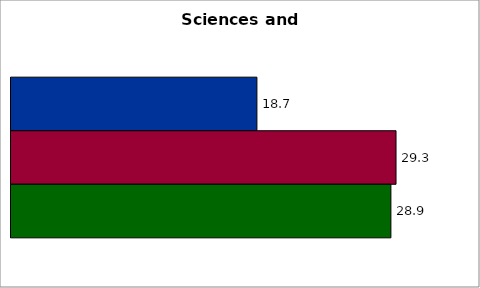
| Category | 50 states and D.C. | SREB states | Series 2 |
|---|---|---|---|
| 0 | 18.711 | 29.296 | 28.905 |